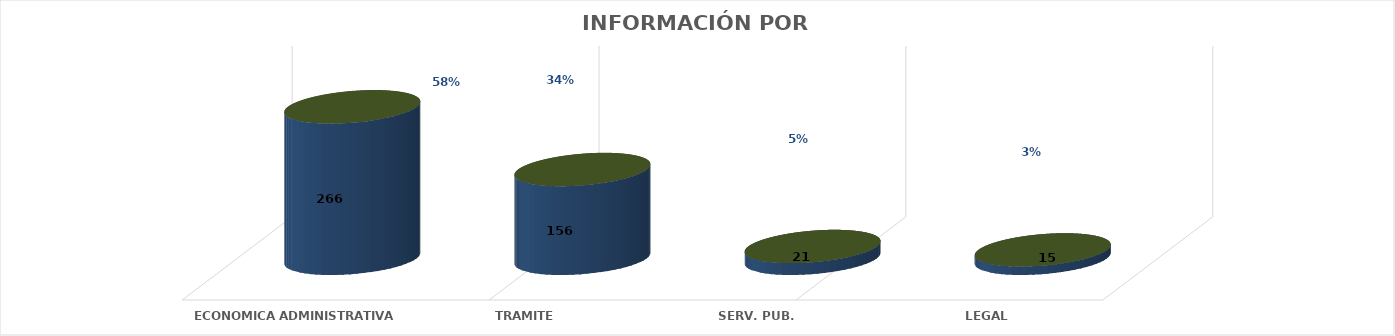
| Category | Series 0 | Series 1 | Series 2 | Series 3 | Series 4 |
|---|---|---|---|---|---|
| ECONOMICA ADMINISTRATIVA |  |  |  | 266 | 0.581 |
| TRAMITE |  |  |  | 156 | 0.341 |
| SERV. PUB. |  |  |  | 21 | 0.046 |
| LEGAL |  |  |  | 15 | 0.033 |